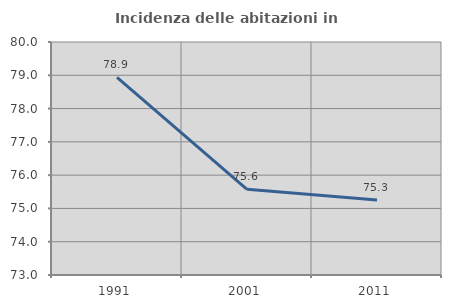
| Category | Incidenza delle abitazioni in proprietà  |
|---|---|
| 1991.0 | 78.939 |
| 2001.0 | 75.575 |
| 2011.0 | 75.255 |